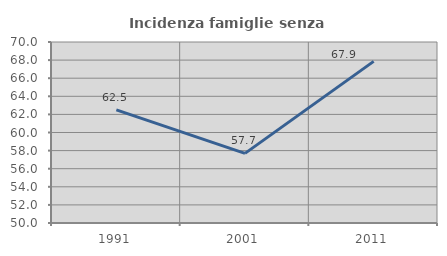
| Category | Incidenza famiglie senza nuclei |
|---|---|
| 1991.0 | 62.5 |
| 2001.0 | 57.692 |
| 2011.0 | 67.857 |